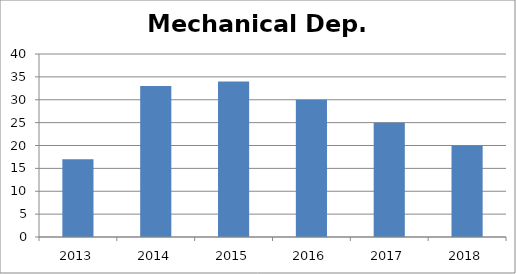
| Category | Mechanical Dep. Publications |
|---|---|
| 0 | 17 |
| 1 | 33 |
| 2 | 34 |
| 3 | 30 |
| 4 | 25 |
| 5 | 20 |